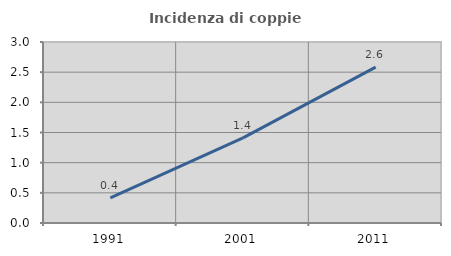
| Category | Incidenza di coppie miste |
|---|---|
| 1991.0 | 0.416 |
| 2001.0 | 1.411 |
| 2011.0 | 2.583 |